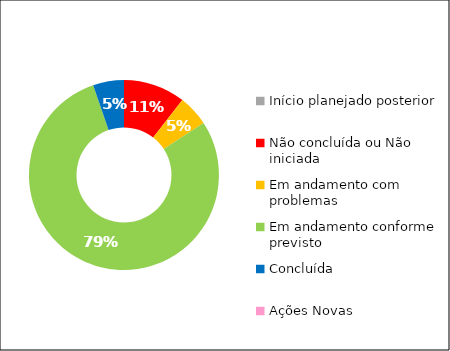
| Category | Series 0 |
|---|---|
| Início planejado posterior | 0 |
| Não concluída ou Não iniciada | 2 |
| Em andamento com problemas | 1 |
| Em andamento conforme previsto | 15 |
| Concluída | 1 |
| Ações Novas | 0 |